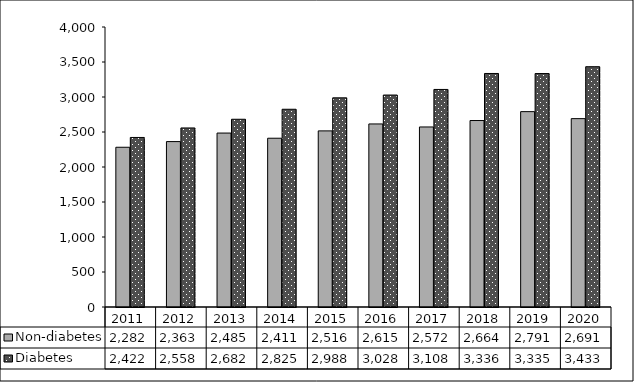
| Category | Non-diabetes | Diabetes |
|---|---|---|
| 2011 | 2282 | 2422 |
| 2012 | 2363 | 2558 |
| 2013 | 2485 | 2682 |
| 2014 | 2411 | 2825 |
| 2015 | 2516 | 2988 |
| 2016 | 2615 | 3028 |
| 2017 | 2572 | 3108 |
| 2018 | 2664 | 3336 |
| 2019 | 2791 | 3335 |
| 2020 | 2691 | 3433 |